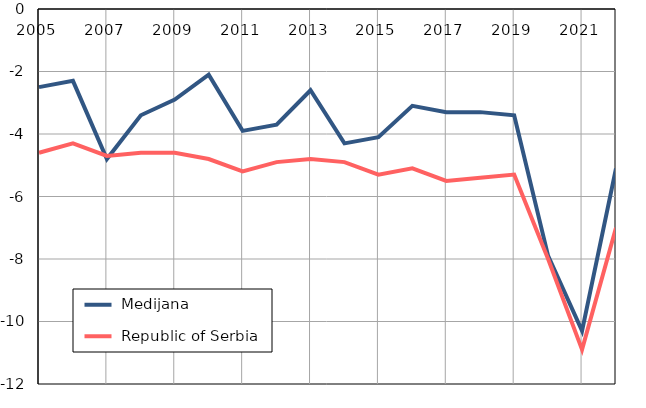
| Category |  Medijana |  Republic of Serbia |
|---|---|---|
| 2005.0 | -2.5 | -4.6 |
| 2006.0 | -2.3 | -4.3 |
| 2007.0 | -4.8 | -4.7 |
| 2008.0 | -3.4 | -4.6 |
| 2009.0 | -2.9 | -4.6 |
| 2010.0 | -2.1 | -4.8 |
| 2011.0 | -3.9 | -5.2 |
| 2012.0 | -3.7 | -4.9 |
| 2013.0 | -2.6 | -4.8 |
| 2014.0 | -4.3 | -4.9 |
| 2015.0 | -4.1 | -5.3 |
| 2016.0 | -3.1 | -5.1 |
| 2017.0 | -3.3 | -5.5 |
| 2018.0 | -3.3 | -5.4 |
| 2019.0 | -3.4 | -5.3 |
| 2020.0 | -7.9 | -8 |
| 2021.0 | -10.3 | -10.9 |
| 2022.0 | -5.1 | -7 |